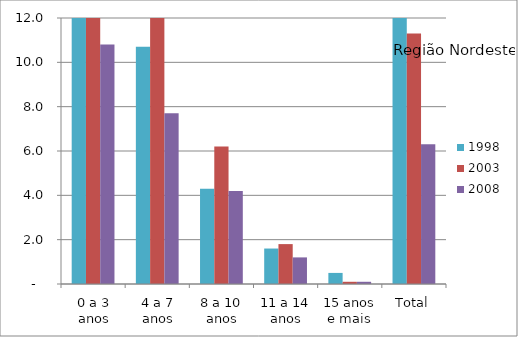
| Category | 1998 | 2003 | 2008 |
|---|---|---|---|
| 0 a 3 anos | 18.1 | 16.5 | 10.8 |
| 4 a 7 anos | 10.7 | 13 | 7.7 |
| 8 a 10 anos | 4.3 | 6.2 | 4.2 |
| 11 a 14 anos | 1.6 | 1.8 | 1.2 |
| 15 anos e mais | 0.5 | 0.1 | 0.1 |
| Total | 12.2 | 11.3 | 6.3 |